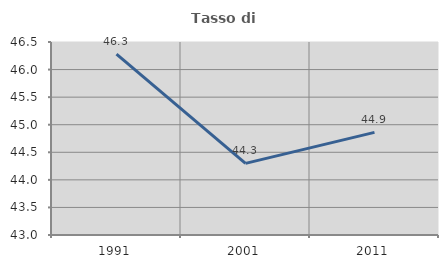
| Category | Tasso di occupazione   |
|---|---|
| 1991.0 | 46.281 |
| 2001.0 | 44.298 |
| 2011.0 | 44.862 |